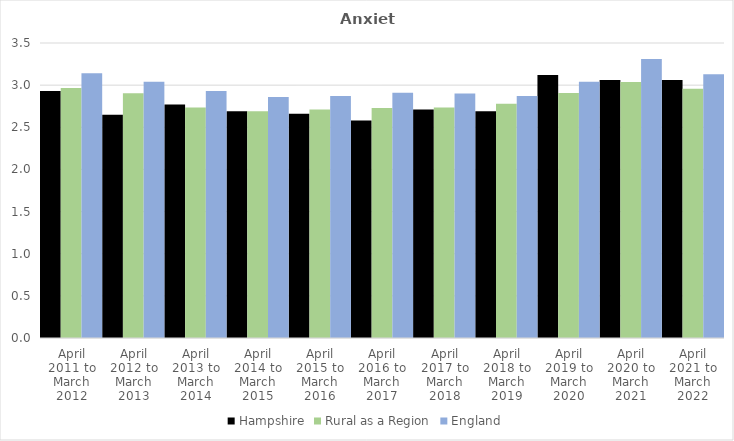
| Category | Hampshire | Rural as a Region | England |
|---|---|---|---|
| April 2011 to March 2012 | 2.93 | 2.967 | 3.14 |
| April 2012 to March 2013 | 2.65 | 2.904 | 3.04 |
| April 2013 to March 2014 | 2.77 | 2.734 | 2.93 |
| April 2014 to March 2015 | 2.69 | 2.691 | 2.86 |
| April 2015 to March 2016 | 2.66 | 2.711 | 2.87 |
| April 2016 to March 2017 | 2.58 | 2.729 | 2.91 |
| April 2017 to March 2018 | 2.71 | 2.736 | 2.9 |
| April 2018 to March 2019 | 2.69 | 2.78 | 2.87 |
| April 2019 to March 2020 | 3.12 | 2.908 | 3.04 |
| April 2020 to March 2021 | 3.06 | 3.036 | 3.31 |
| April 2021 to March 2022 | 3.06 | 2.956 | 3.13 |